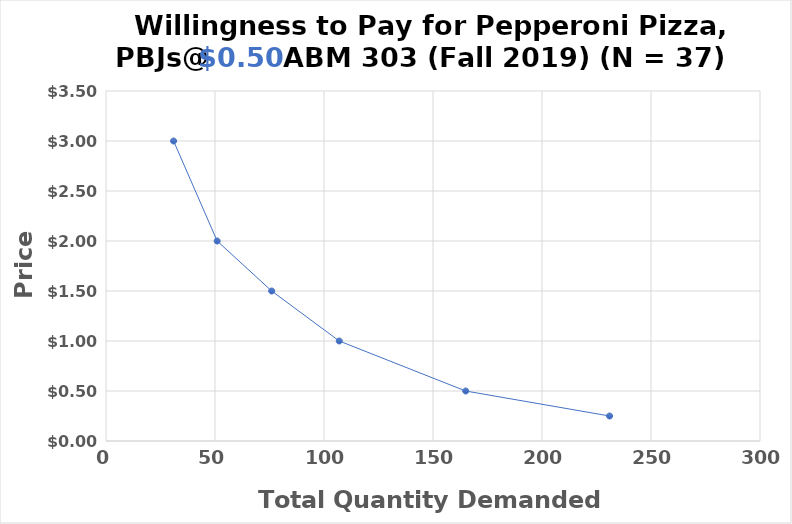
| Category | Price |
|---|---|
| 31.0 | 3 |
| 51.0 | 2 |
| 76.0 | 1.5 |
| 107.0 | 1 |
| 165.0 | 0.5 |
| 231.0 | 0.25 |